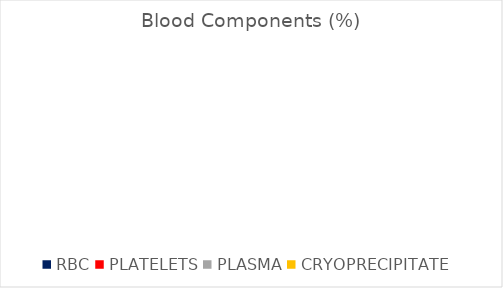
| Category | Series 0 |
|---|---|
| RBC | 0 |
| PLATELETS | 0 |
| PLASMA | 0 |
| CRYOPRECIPITATE | 0 |